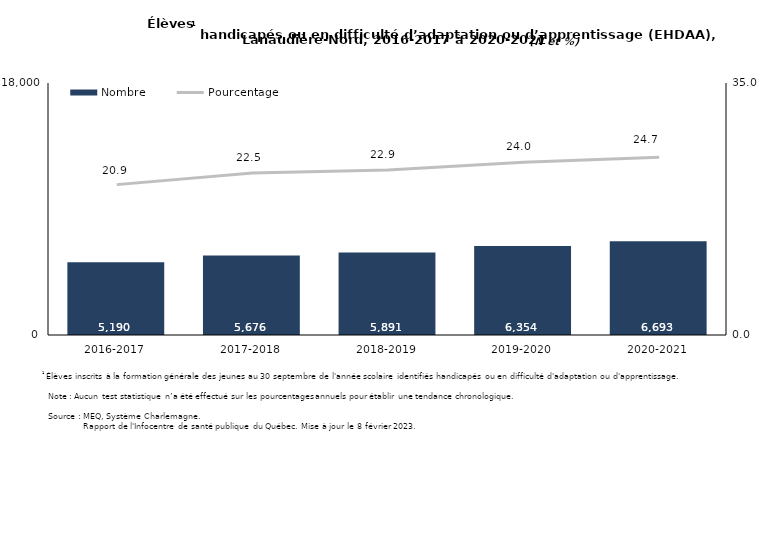
| Category | Nombre |
|---|---|
| 2016-2017 | 5190 |
| 2017-2018 | 5676 |
| 2018-2019 | 5891 |
| 2019-2020 | 6354 |
| 2020-2021 | 6693 |